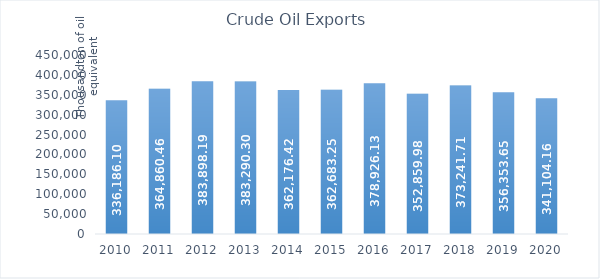
| Category | Crude Oil Exports |
|---|---|
| 2010.0 | 336186.1 |
| 2011.0 | 364860.46 |
| 2012.0 | 383898.19 |
| 2013.0 | 383290.3 |
| 2014.0 | 362176.42 |
| 2015.0 | 362683.25 |
| 2016.0 | 378926.13 |
| 2017.0 | 352859.98 |
| 2018.0 | 373241.71 |
| 2019.0 | 356353.65 |
| 2020.0 | 341104.16 |